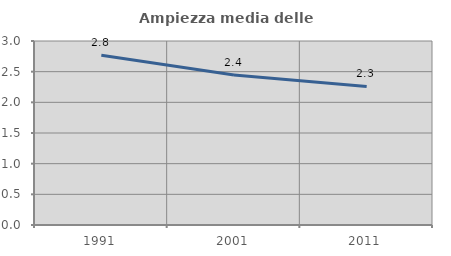
| Category | Ampiezza media delle famiglie |
|---|---|
| 1991.0 | 2.768 |
| 2001.0 | 2.445 |
| 2011.0 | 2.258 |